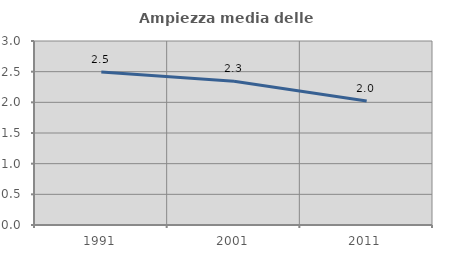
| Category | Ampiezza media delle famiglie |
|---|---|
| 1991.0 | 2.493 |
| 2001.0 | 2.343 |
| 2011.0 | 2.021 |